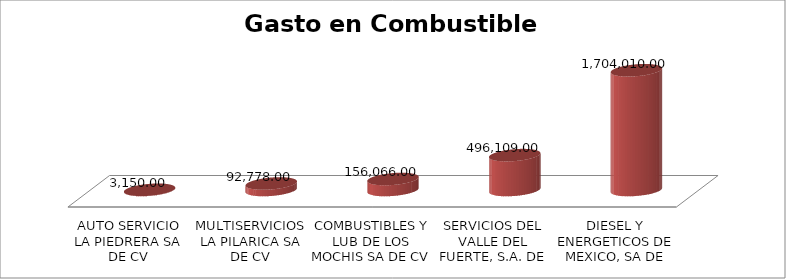
| Category | Suma |
|---|---|
| AUTO SERVICIO LA PIEDRERA SA DE CV | 3150 |
| MULTISERVICIOS LA PILARICA SA DE CV | 92778 |
| COMBUSTIBLES Y LUB DE LOS MOCHIS SA DE CV | 156066 |
| SERVICIOS DEL VALLE DEL FUERTE, S.A. DE C.V. | 496109 |
| DIESEL Y ENERGETICOS DE MEXICO, SA DE CV | 1704010 |